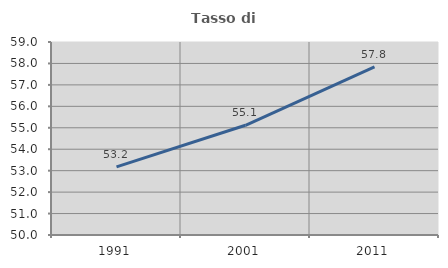
| Category | Tasso di occupazione   |
|---|---|
| 1991.0 | 53.18 |
| 2001.0 | 55.115 |
| 2011.0 | 57.844 |